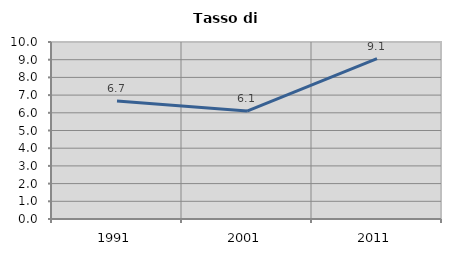
| Category | Tasso di disoccupazione   |
|---|---|
| 1991.0 | 6.667 |
| 2001.0 | 6.098 |
| 2011.0 | 9.061 |